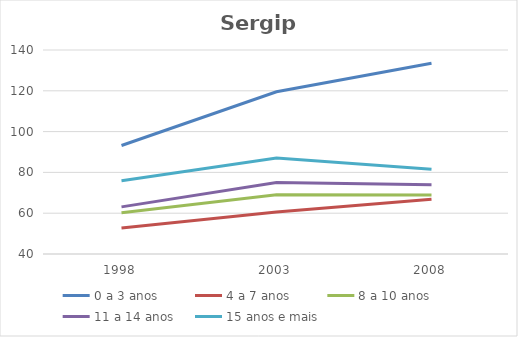
| Category | 0 a 3 anos | 4 a 7 anos | 8 a 10 anos | 11 a 14 anos | 15 anos e mais |
|---|---|---|---|---|---|
| 1998.0 | 93.2 | 52.7 | 60.2 | 63.1 | 75.9 |
| 2003.0 | 119.5 | 60.6 | 69.1 | 75.1 | 87.1 |
| 2008.0 | 133.5 | 66.8 | 68.9 | 74 | 81.6 |